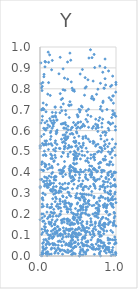
| Category | Series 0 |
|---|---|
| 0.025197886812686532 | 0.001 |
| 0.21413028773130482 | 0.596 |
| 0.48858155376974666 | 0.104 |
| 0.40430509097627965 | 0.222 |
| 0.04443078745256157 | 0.238 |
| 0.2402282362803827 | 0.051 |
| 0.5718057877575642 | 0.403 |
| 0.8271010419121944 | 0.734 |
| 0.4704751730745522 | 0.289 |
| 0.4556977791973077 | 0.439 |
| 0.2898596506972968 | 0.172 |
| 0.5551192829058258 | 0.482 |
| 0.45110149768724395 | 0.366 |
| 0.1990744925022092 | 0.713 |
| 0.691329299526118 | 0.12 |
| 0.06095792570090608 | 0.378 |
| 0.8773311487287229 | 0.209 |
| 0.006263118927576361 | 0.366 |
| 0.5590345230677798 | 0.165 |
| 0.7389482861343031 | 0.057 |
| 0.5720819566454467 | 0.247 |
| 0.8236305486623416 | 0.184 |
| 0.7119050161042874 | 0.285 |
| 0.07879720333586604 | 0.48 |
| 0.6499105780047775 | 0.413 |
| 0.07721514202325519 | 0.436 |
| 0.45784729605314545 | 0.414 |
| 0.02451577731107668 | 0.128 |
| 0.932908844918849 | 0.748 |
| 0.024970246443399624 | 0.234 |
| 0.4604541875513869 | 0.542 |
| 0.3451244808872541 | 0.253 |
| 0.9652149228587263 | 0.766 |
| 0.36962896928921374 | 0.016 |
| 0.16606018607317763 | 0.4 |
| 0.36483351287234056 | 0.178 |
| 0.7315489892914839 | 0.526 |
| 0.1860098832643824 | 0.059 |
| 0.17895400449943855 | 0.348 |
| 0.11813524467806491 | 0.163 |
| 0.7193814075641267 | 0.191 |
| 0.11759875074498838 | 0.085 |
| 0.9832061763752971 | 0.296 |
| 0.6063529815520603 | 0.051 |
| 0.0034663127849482445 | 0.528 |
| 0.12844158741016154 | 0.657 |
| 0.10420675366963283 | 0.628 |
| 0.727859347683194 | 0.155 |
| 0.6341998290440304 | 0.252 |
| 0.03020123077577519 | 0.248 |
| 0.15400965720167747 | 0.248 |
| 0.4671220865261183 | 0.416 |
| 0.5026561008548203 | 0.218 |
| 0.15286622200836197 | 0.891 |
| 0.4880335348712509 | 0.194 |
| 0.22558941656411857 | 0.174 |
| 0.4525285808456777 | 0.501 |
| 0.6771728218249609 | 0.754 |
| 0.9579707804010086 | 0.337 |
| 0.7197603956896848 | 0.901 |
| 0.1628848345181404 | 0.466 |
| 0.9646907159612438 | 0.233 |
| 0.020277503277967512 | 0.439 |
| 0.3299731509932555 | 0.265 |
| 0.5869344921777998 | 0.48 |
| 0.6563274902294516 | 0.389 |
| 0.9625176503764112 | 0.006 |
| 0.0900204820275502 | 0.072 |
| 0.5143163906701762 | 0.539 |
| 0.5907523411117203 | 0.333 |
| 0.6483754162402939 | 0.414 |
| 0.13159456360421262 | 0.347 |
| 0.6192005846492004 | 0.164 |
| 0.19874089762204883 | 0.105 |
| 0.47805872418403994 | 0.527 |
| 0.224144399712493 | 0.114 |
| 0.5606237482235635 | 0.206 |
| 0.03895434136517739 | 0.706 |
| 0.560359705210383 | 0.234 |
| 0.8636184292533413 | 0.818 |
| 0.9850959252697519 | 0.342 |
| 0.8465759924404586 | 0.461 |
| 0.9621171285710721 | 0.159 |
| 0.36093184160355885 | 0.563 |
| 0.5720134205714212 | 0.326 |
| 0.5455029559459526 | 0.205 |
| 0.5497223853607801 | 0.228 |
| 0.9687483142185594 | 0.158 |
| 0.9772666574351008 | 0.676 |
| 0.579280783987958 | 0.281 |
| 0.3032145212615386 | 0.284 |
| 0.8405511302019216 | 0.063 |
| 0.9252767246979215 | 0.163 |
| 0.6155288811631345 | 0.136 |
| 0.9733234656916732 | 0.15 |
| 0.03372061253257752 | 0.009 |
| 0.30392479443316134 | 0.579 |
| 0.4854990220822477 | 0.588 |
| 0.04748954717181819 | 0.409 |
| 0.3844109596772901 | 0.663 |
| 0.4324153831427141 | 0.113 |
| 0.24284131026815214 | 0.227 |
| 0.7341945231759877 | 0.126 |
| 0.17546131762466466 | 0.091 |
| 0.6069556300938677 | 0.37 |
| 0.8280435117954948 | 0.41 |
| 0.3440096239837005 | 0.06 |
| 0.7291566637212363 | 0.162 |
| 0.4047157809861346 | 0.937 |
| 0.7065359583478036 | 0.485 |
| 0.7001695145404064 | 0.415 |
| 0.4519627906702409 | 0.788 |
| 0.5216647634367185 | 0.389 |
| 0.3122712158800727 | 0.635 |
| 0.5638380115749367 | 0.36 |
| 0.9989264841207557 | 0.821 |
| 0.16300541404474966 | 0.308 |
| 0.8561175256296689 | 0.942 |
| 0.6394839722827644 | 0.616 |
| 0.5562589490872132 | 0.62 |
| 0.2927356546245098 | 0.324 |
| 0.8308332078736624 | 0.127 |
| 0.2214524880440789 | 0.591 |
| 0.002009016530433949 | 0.516 |
| 0.41071559563643967 | 0.061 |
| 0.4608585529967485 | 0.183 |
| 0.9269944205853824 | 0.018 |
| 0.37656805977944396 | 0.105 |
| 0.060794674670184956 | 0.532 |
| 0.6246542446006023 | 0.642 |
| 0.5515205720867589 | 0.502 |
| 0.11634807004211212 | 0.339 |
| 0.4697110657740725 | 0.198 |
| 0.5108246743888863 | 0.36 |
| 0.8786510272756582 | 0.119 |
| 0.5263109892197093 | 0.173 |
| 0.5504721788012336 | 0.285 |
| 0.2916340658201185 | 0.408 |
| 0.04049508910683952 | 0.201 |
| 0.8926720065154733 | 0.388 |
| 0.10773495395476929 | 0.975 |
| 0.4898359227873317 | 0.402 |
| 0.6254606844263559 | 0.235 |
| 0.07591637961338582 | 0.539 |
| 0.908100629852388 | 0.031 |
| 0.7134330689061162 | 0.373 |
| 0.6722248795017084 | 0.077 |
| 0.2123672538692093 | 0.379 |
| 0.7001525258719128 | 0.549 |
| 0.1783853008018329 | 0.649 |
| 0.4398765930227654 | 0.486 |
| 0.33990844237472817 | 0.677 |
| 0.11345560551095935 | 0.927 |
| 0.4723057709839633 | 0.545 |
| 0.705190465527857 | 0.752 |
| 0.8269691382516214 | 0.045 |
| 0.3925819573000705 | 0.054 |
| 0.9274287569215203 | 0.347 |
| 0.7442960541273467 | 0.774 |
| 0.11091688621002427 | 0.509 |
| 0.9620529973086206 | 0.146 |
| 0.8960482790314653 | 0.076 |
| 0.42528711193980473 | 0.13 |
| 0.16205937459268882 | 0.687 |
| 0.19906835078795504 | 0.542 |
| 0.4007988758825842 | 0.433 |
| 0.33677854988451317 | 0.39 |
| 0.8237855923326048 | 0.063 |
| 0.018691785293414642 | 0.701 |
| 0.26199672347784064 | 0.685 |
| 0.4721522799767147 | 0.11 |
| 0.12750994281392602 | 0.231 |
| 0.3948806305217383 | 0.022 |
| 0.38684035037920983 | 0.291 |
| 0.585699446806898 | 0.622 |
| 0.8045610104169469 | 0.497 |
| 0.4477837749919765 | 0.794 |
| 0.27500289237935216 | 0.068 |
| 0.4072392921025173 | 0.374 |
| 0.19011399654209382 | 0.037 |
| 0.46210866643680726 | 0.046 |
| 0.6039283758396782 | 0.251 |
| 0.5859902896639042 | 0.261 |
| 0.9575392210357279 | 0.437 |
| 0.15934730125391794 | 0.611 |
| 0.8533247778122379 | 0.157 |
| 0.09496689605058295 | 0.12 |
| 0.3733653996215305 | 0.05 |
| 0.7647526137512872 | 0.079 |
| 0.7914051635638613 | 0.449 |
| 0.5612930555437305 | 0.294 |
| 0.26742929918030245 | 0.198 |
| 0.49782769445678277 | 0.665 |
| 0.8138850335807942 | 0.617 |
| 0.30227731882785824 | 0.38 |
| 0.7697588845792649 | 0.217 |
| 0.533483441632903 | 0.239 |
| 0.22324586865950735 | 0.534 |
| 0.949139581280821 | 0.018 |
| 0.6607085980914413 | 0.333 |
| 0.1947012332926752 | 0.013 |
| 0.7985787309010601 | 0.575 |
| 0.6409905802365432 | 0.293 |
| 0.2773298578979633 | 0.214 |
| 0.8306411127015996 | 0.741 |
| 0.7038953628603181 | 0.375 |
| 0.40169764314069123 | 0.237 |
| 0.19084714774591505 | 0.366 |
| 0.3948477369461152 | 0.048 |
| 0.9478345317359333 | 0.241 |
| 0.22095314712342995 | 0.65 |
| 0.9955584897675781 | 0.065 |
| 0.08972932439687686 | 0.109 |
| 0.9580457837383053 | 0.285 |
| 0.9168131204737994 | 0.08 |
| 0.6781548436303226 | 0.054 |
| 0.5320187547295566 | 0.464 |
| 0.07722172022288609 | 0.013 |
| 0.09952379328775052 | 0.372 |
| 0.6907323391986143 | 0.053 |
| 0.06546834949911273 | 0.344 |
| 0.41030302669614693 | 0.044 |
| 0.44120235004911434 | 0.015 |
| 0.4177004337748922 | 0.522 |
| 0.8440230135647513 | 0.527 |
| 0.07774349367078082 | 0.602 |
| 0.7191535492045975 | 0.46 |
| 0.44390767256304997 | 0.548 |
| 0.7031456640398135 | 0.104 |
| 0.7413314652011742 | 0.193 |
| 0.19550013501050523 | 0.15 |
| 0.9221465949091429 | 0.079 |
| 0.6005881622952653 | 0.574 |
| 0.032324977127234034 | 0.539 |
| 0.7904018509659861 | 0.075 |
| 0.5589857761309275 | 0.295 |
| 0.8992256556505386 | 0.028 |
| 0.41007141490044796 | 0.159 |
| 0.6384191648891349 | 0.448 |
| 0.5309507124736739 | 0.02 |
| 0.1920913908414642 | 0.131 |
| 0.564624306797594 | 0.052 |
| 0.19621196957650766 | 0.482 |
| 0.5385009965150567 | 0.186 |
| 0.7887047409682093 | 0.157 |
| 0.3345130764218439 | 0.255 |
| 0.6307614424700095 | 0.843 |
| 0.9979676357946458 | 0.143 |
| 0.9581524225746767 | 0.248 |
| 0.956140144640581 | 0.861 |
| 0.28324023148681077 | 0.559 |
| 0.5363361855264522 | 0.005 |
| 0.9263922902481513 | 0.632 |
| 0.06902277982221361 | 0.155 |
| 0.7830242848627688 | 0.238 |
| 0.4398891300061797 | 0.093 |
| 0.7709979854277558 | 0.226 |
| 0.4801212756608354 | 0.28 |
| 0.47148464497950515 | 0.629 |
| 0.0609080031958279 | 0.191 |
| 0.15383076465899492 | 0.038 |
| 0.46350673560573785 | 0.067 |
| 0.8519001798606042 | 0.354 |
| 0.6111226021604117 | 0.694 |
| 0.2691427319630266 | 0.097 |
| 0.45827107349517104 | 0.044 |
| 0.5659597745994608 | 0.233 |
| 0.7587466678810794 | 0.626 |
| 0.5297909737599926 | 0.219 |
| 0.9009825701256149 | 0.498 |
| 0.7920743543193515 | 0.101 |
| 0.07185384768214675 | 0.138 |
| 0.603325422418182 | 0.019 |
| 0.3390733369968081 | 0.628 |
| 0.7712304483402567 | 0.106 |
| 0.5942333697378763 | 0.853 |
| 0.4495090726149603 | 0.109 |
| 0.7978491464313873 | 0.135 |
| 0.46501316111742474 | 0.124 |
| 0.4474738549652595 | 0.174 |
| 0.8416516000586042 | 0.804 |
| 0.754150032857336 | 0.621 |
| 0.9747012308747603 | 0.077 |
| 0.7090250317374539 | 0.106 |
| 0.7814782995078428 | 0.368 |
| 0.4777594377030744 | 0.091 |
| 0.8039837319778746 | 0.064 |
| 0.3037235592681554 | 0.896 |
| 0.24634716773017706 | 0.303 |
| 0.6173185867517751 | 0.049 |
| 0.02905400296289551 | 0.65 |
| 0.46434181517386075 | 0.626 |
| 0.7063738152059562 | 0.748 |
| 0.7950511141068445 | 0.826 |
| 0.18985875597604251 | 0.207 |
| 0.9987642036417084 | 0.831 |
| 0.6056513557919887 | 0.565 |
| 0.22006762770690702 | 0.12 |
| 0.11377161289866244 | 0.536 |
| 0.14254426674013632 | 0.312 |
| 0.3789466956351638 | 0.529 |
| 0.8024915338016808 | 0.56 |
| 0.4436654086973385 | 0.202 |
| 0.8929763839404897 | 0.04 |
| 0.32361347522001516 | 0.12 |
| 0.5679959793559715 | 0.123 |
| 0.5447556264900413 | 0.717 |
| 0.2242847394513191 | 0.652 |
| 0.5539732363056757 | 0.06 |
| 0.5344828855191042 | 0.341 |
| 0.7868973597773778 | 0.093 |
| 0.365322702147006 | 0.515 |
| 0.3625304517608171 | 0.21 |
| 0.3368842922956712 | 0.557 |
| 0.109242545879775 | 0.066 |
| 0.13980217346681978 | 0.317 |
| 0.3798862737535471 | 0.347 |
| 0.8943401027661623 | 0.086 |
| 0.42300453299720064 | 0.089 |
| 0.4418980410397355 | 0.639 |
| 0.6805002192378595 | 0.388 |
| 0.7618885101849137 | 0.798 |
| 0.0901728759682705 | 0.059 |
| 0.8561016237326388 | 0.307 |
| 0.5630754014052055 | 0.318 |
| 0.4798194514959362 | 0.49 |
| 0.09396702314795169 | 0.236 |
| 0.7734039897289361 | 0.146 |
| 0.39186401893902345 | 0.122 |
| 0.03593448506933694 | 0.113 |
| 0.874344498336461 | 0.236 |
| 0.38717506520077904 | 0.719 |
| 0.33676000165301123 | 0.695 |
| 0.3402873663949575 | 0.571 |
| 0.9066087811230189 | 0.041 |
| 0.9796217052784945 | 0.684 |
| 0.1267845846487663 | 0.962 |
| 0.3343927279772776 | 0.107 |
| 0.13182132641104571 | 0.341 |
| 0.7054442693675511 | 0.344 |
| 0.9804921510279025 | 0.057 |
| 0.8447930930610218 | 0.802 |
| 0.16408999021218484 | 0.06 |
| 0.8432070593426235 | 0.143 |
| 0.2655241107842574 | 0.951 |
| 0.9114323091118032 | 0.02 |
| 0.14802851539035788 | 0.009 |
| 0.5972631802874754 | 0.378 |
| 0.4020903179344374 | 0.245 |
| 0.9616632420855432 | 0.269 |
| 0.5405655801553322 | 0.156 |
| 0.17902962964832225 | 0.332 |
| 0.23035647603148768 | 0.248 |
| 0.7849736417659828 | 0.016 |
| 0.8013522572638774 | 0.072 |
| 0.8910612452694039 | 0.303 |
| 0.2837840114173902 | 0.393 |
| 0.6642114259134768 | 0.987 |
| 0.06900532290616723 | 0.293 |
| 0.1425757306645059 | 0.154 |
| 0.25237411626508244 | 0.312 |
| 0.8273745335925794 | 0.039 |
| 0.4005068298134261 | 0.15 |
| 0.0660209646970098 | 0.931 |
| 0.12842560673679115 | 0.342 |
| 0.6180225649797012 | 0.154 |
| 0.7801038222977863 | 0.035 |
| 0.3771680922040377 | 0.122 |
| 0.8087264641851538 | 0.41 |
| 0.6285683813453797 | 0.048 |
| 0.8374726857791308 | 0.234 |
| 0.09655688380406591 | 0.613 |
| 0.911122479115635 | 0.401 |
| 0.06475351923570172 | 0.609 |
| 0.18836173312103865 | 0.365 |
| 0.04159156931063723 | 0.732 |
| 0.6213430961428119 | 0.029 |
| 0.06555629846780175 | 0.905 |
| 0.04819458217653916 | 0.611 |
| 0.8717397820950386 | 0.015 |
| 0.3280843878281625 | 0.023 |
| 0.6854265176475329 | 0.764 |
| 0.955603323694563 | 0.113 |
| 0.20473497123445028 | 0.471 |
| 0.7824286014701479 | 0.01 |
| 0.043501074573775944 | 0.012 |
| 0.2741756379165735 | 0.33 |
| 0.6862199539612959 | 0.149 |
| 0.20530764217216413 | 0.282 |
| 0.10084867838045031 | 0.02 |
| 0.9577612307566913 | 0.636 |
| 0.9583216785881982 | 0.041 |
| 0.3505811357923594 | 0.28 |
| 0.9963015368545382 | 0.668 |
| 0.5897000538285105 | 0.089 |
| 0.8689766764764804 | 0.37 |
| 0.5233034107759669 | 0.689 |
| 0.5307124964081413 | 0.239 |
| 0.3514999601532548 | 0.056 |
| 0.9972431636012987 | 0.013 |
| 0.6683831231112578 | 0.178 |
| 0.06827036540755582 | 0.032 |
| 0.9311851737835538 | 0.405 |
| 0.9287364172254375 | 0.309 |
| 0.5400762027035731 | 0.333 |
| 0.7972730777159447 | 0.023 |
| 0.20582541574065227 | 0.021 |
| 0.7333016324426805 | 0.206 |
| 0.9892963768008527 | 0.482 |
| 0.7071663725097103 | 0.033 |
| 0.5952177472506838 | 0.206 |
| 0.15494662954196725 | 0.09 |
| 0.14060501553581395 | 0.487 |
| 0.584240968639001 | 0.296 |
| 0.02456371904780985 | 0.449 |
| 0.9953113803691618 | 0.536 |
| 0.5161148495228361 | 0.488 |
| 0.6296425540134282 | 0.365 |
| 0.418298774010357 | 0.614 |
| 0.25671178219258706 | 0.072 |
| 0.830897943676508 | 0.463 |
| 0.7585715228575746 | 0.067 |
| 0.051402543011725754 | 0.034 |
| 0.9281959228728854 | 0.811 |
| 0.7676664195996382 | 0.032 |
| 0.9226290684925353 | 0.488 |
| 0.312598411852811 | 0.612 |
| 0.29678375206375784 | 0.101 |
| 0.14683245325442296 | 0.032 |
| 0.5530640571064125 | 0.147 |
| 0.703536821029218 | 0.474 |
| 0.30691204129053407 | 0.728 |
| 0.565906182165732 | 0.57 |
| 0.9906668111566744 | 0.273 |
| 0.35659821072695297 | 0.229 |
| 0.9936353715936959 | 0.603 |
| 0.5466450541318641 | 0.619 |
| 0.41653239412111864 | 0.027 |
| 0.1997159060315793 | 0.131 |
| 0.05321037671463913 | 0.869 |
| 0.7776548030385441 | 0.422 |
| 0.8617400159088089 | 0.151 |
| 0.6083169495797259 | 0.81 |
| 0.8184272214999384 | 0.505 |
| 0.9195428792942364 | 0.199 |
| 0.36378232860726223 | 0.326 |
| 0.991878699202656 | 0.619 |
| 0.608768730796755 | 0.224 |
| 0.9446866975256019 | 0.663 |
| 0.7240141867323279 | 0.488 |
| 0.311948856951065 | 0.12 |
| 0.04449304517615216 | 0.356 |
| 0.7626813930786956 | 0.535 |
| 0.7067013137214129 | 0.419 |
| 0.09129774841451888 | 0.21 |
| 0.40824932267050973 | 0.521 |
| 0.04075679090351936 | 0.409 |
| 0.9017948677249393 | 0.264 |
| 0.8991388103806153 | 0.639 |
| 0.32816857832920254 | 0.521 |
| 0.3923249409852855 | 0.428 |
| 0.8683749630262318 | 0.376 |
| 0.7710112499006397 | 0.049 |
| 0.8884881725991269 | 0.354 |
| 0.09121330825763985 | 0.645 |
| 0.4966386775197532 | 0.254 |
| 0.16218776041944394 | 0.422 |
| 0.500190707641086 | 0.215 |
| 0.08820914998534501 | 0.336 |
| 0.21659341048255243 | 0.238 |
| 0.9255816631310064 | 0.297 |
| 0.6566712186370676 | 0.044 |
| 0.0332735009136601 | 0.279 |
| 0.8452537849310326 | 0.407 |
| 0.6195150062813478 | 0.456 |
| 0.4250156352318821 | 0.381 |
| 0.31996485833903143 | 0.512 |
| 0.19540169428684628 | 0.38 |
| 0.12254154330457911 | 0.055 |
| 0.12989238232046163 | 0.195 |
| 0.02745449906291475 | 0.275 |
| 0.5287159830795737 | 0.871 |
| 0.8820832382543359 | 0.555 |
| 0.8494270692677051 | 0.313 |
| 0.19964846248102697 | 0.671 |
| 0.037235395054718845 | 0.166 |
| 0.3411830118471907 | 0.237 |
| 0.7153454797790259 | 0.418 |
| 0.09756358928471676 | 0.121 |
| 0.314529658136104 | 0.32 |
| 0.32275917409917976 | 0.452 |
| 0.0688741857431302 | 0.428 |
| 0.6046699383076093 | 0.218 |
| 0.4402822018034379 | 0.443 |
| 0.996306204124361 | 0.784 |
| 0.7100596017940655 | 0.243 |
| 0.9504402230552976 | 0.078 |
| 0.20674249737522143 | 0.363 |
| 0.20445646676715956 | 0.165 |
| 0.35303897679245555 | 0.223 |
| 0.020991257393472962 | 0.104 |
| 0.25986869762227505 | 0.347 |
| 0.35416087217946757 | 0.125 |
| 0.5336332255170942 | 0.524 |
| 0.8697338250638036 | 0.042 |
| 0.4140555429475413 | 0.208 |
| 0.26648884530838735 | 0.777 |
| 0.856637751015408 | 0.902 |
| 0.5578722112487486 | 0.892 |
| 0.329246377771221 | 0.58 |
| 0.5096744190770951 | 0.137 |
| 0.9345192221607248 | 0.496 |
| 0.5774820963427973 | 0.055 |
| 0.9925700591350165 | 0.078 |
| 0.8810810710595229 | 0.701 |
| 0.956718124582553 | 0.766 |
| 0.7249271586273993 | 0.411 |
| 0.4391326144345672 | 0.203 |
| 0.5798870884685975 | 0.268 |
| 0.4426074136398357 | 0.114 |
| 0.82779421628915 | 0.281 |
| 0.44868200021481375 | 0.459 |
| 0.8131620068609434 | 0.401 |
| 0.637359095390284 | 0.702 |
| 0.8960285661212486 | 0.175 |
| 0.7978429306067848 | 0.069 |
| 0.7145517874532945 | 0.339 |
| 0.4561965525603071 | 0.482 |
| 0.6884866000229004 | 0.611 |
| 0.028965594277245432 | 0.183 |
| 0.1807525849416649 | 0.223 |
| 0.6397807507713877 | 0.322 |
| 0.5684732578866653 | 0.63 |
| 0.5931660643704855 | 0.803 |
| 0.261786166113126 | 0.272 |
| 0.8876200636945151 | 0.245 |
| 0.4487907933041667 | 0.063 |
| 0.3233993644040576 | 0.11 |
| 0.43415271576057834 | 0.376 |
| 0.7114686246968164 | 0.472 |
| 0.6711620660729468 | 0.166 |
| 0.6630019409705454 | 0.147 |
| 0.05269819204539017 | 0.702 |
| 0.7611512008091109 | 0.596 |
| 0.9775651135441973 | 0.402 |
| 0.24959292531541388 | 0.872 |
| 0.5000706729439848 | 0.077 |
| 0.7465936472323421 | 0.035 |
| 0.5049109423046944 | 0.276 |
| 0.23969644766741405 | 0.013 |
| 0.8347925246554861 | 0.342 |
| 0.0959882674558713 | 0.328 |
| 0.012521997520578698 | 0.637 |
| 0.43706325663492596 | 0.037 |
| 0.5006835675842818 | 0.156 |
| 0.26465227691043114 | 0.25 |
| 0.3552849140221833 | 0.176 |
| 0.8036551497422049 | 0.287 |
| 0.4181457259080281 | 0.129 |
| 0.43318215928368853 | 0.112 |
| 0.47112549704367834 | 0.095 |
| 0.4425214507931189 | 0.189 |
| 0.46685887895379174 | 0.227 |
| 0.04113128940026056 | 0.301 |
| 0.5321092516533982 | 0.413 |
| 0.1451893475730942 | 0.572 |
| 0.03692695876547547 | 0.83 |
| 0.09994069957507135 | 0.416 |
| 0.29790795290945526 | 0.633 |
| 0.4992754371769338 | 0.509 |
| 0.3278477220426669 | 0.793 |
| 0.6071406559684883 | 0.516 |
| 0.8486188149233981 | 0.548 |
| 0.44668215720087545 | 0.418 |
| 0.48926871052878385 | 0.676 |
| 0.41552059888665316 | 0.094 |
| 0.3733546468605832 | 0.094 |
| 0.08564745831047638 | 0.36 |
| 0.6713330673606118 | 0.162 |
| 0.3700607583408655 | 0.603 |
| 0.715462399212379 | 0.008 |
| 0.15973226703370302 | 0.173 |
| 0.31768042703101884 | 0.026 |
| 0.5676946750563634 | 0.221 |
| 0.1367985859098083 | 0.558 |
| 0.897304677487291 | 0.269 |
| 0.9943149742453228 | 0.004 |
| 0.865943769350482 | 0.213 |
| 0.453213562134713 | 0.467 |
| 0.46379438933582817 | 0.066 |
| 0.43359219264258675 | 0.181 |
| 0.826118948844565 | 0.879 |
| 0.3927865706566679 | 0.383 |
| 0.8191553173031388 | 0.694 |
| 0.2258253821626356 | 0.602 |
| 0.3675540282564943 | 0.476 |
| 0.6361758176832983 | 0.559 |
| 0.7145916190700001 | 0.471 |
| 0.13043991124868226 | 0.057 |
| 0.8540614756389469 | 0.514 |
| 0.25463349369912447 | 0.515 |
| 0.6266492248097513 | 0.066 |
| 0.04297015630084533 | 0.482 |
| 0.11975325623819955 | 0.439 |
| 0.3906669502186212 | 0.171 |
| 0.9320247772823954 | 0.122 |
| 0.927327456430381 | 0.294 |
| 0.9024232913244205 | 0.061 |
| 0.4700079600875713 | 0.525 |
| 0.5283023933769699 | 0.042 |
| 0.8621366309323681 | 0.46 |
| 0.8482752148918352 | 0.023 |
| 0.6291091611118533 | 0.028 |
| 0.42319676506410875 | 0.159 |
| 0.3696021960044138 | 0.488 |
| 0.9486165741138297 | 0.512 |
| 0.5034294549144543 | 0.639 |
| 0.39301933180583193 | 0.249 |
| 0.36999222800563725 | 0.345 |
| 0.34675650925685186 | 0.092 |
| 0.8694788376665119 | 0.18 |
| 0.002135535394686028 | 0.174 |
| 0.8606907883818727 | 0.578 |
| 0.20808425410671672 | 0.686 |
| 0.8705263382666175 | 0.59 |
| 0.46367729659705104 | 0.495 |
| 0.7928890904335166 | 0.333 |
| 0.2668117334581943 | 0.024 |
| 0.4142991678722696 | 0.024 |
| 0.7636263131023666 | 0.074 |
| 0.5356719211074693 | 0.642 |
| 0.8996771715972701 | 0.386 |
| 0.2571436078848526 | 0.129 |
| 0.19712438231640306 | 0.113 |
| 0.2957044007514875 | 0.754 |
| 0.7887449753168919 | 0.52 |
| 0.49895838852772434 | 0.617 |
| 0.13056355124175167 | 0.097 |
| 0.07663401290700322 | 0.012 |
| 0.3964676051094853 | 0.583 |
| 0.8414700895558236 | 0.12 |
| 0.9038063312198282 | 0.158 |
| 0.6116953818262969 | 0.294 |
| 0.6816556554250641 | 0.309 |
| 0.17024000472087863 | 0.19 |
| 0.31794390955913865 | 0.162 |
| 0.20677181577468862 | 0.516 |
| 0.017207358207501633 | 0.572 |
| 0.15100376709126784 | 0.348 |
| 0.2562237714535004 | 0.032 |
| 0.39917549047811796 | 0.498 |
| 0.6101533309590681 | 0.331 |
| 0.4316524083350014 | 0.152 |
| 0.16207209535150402 | 0.936 |
| 0.23924750196169475 | 0.07 |
| 0.28327490886773976 | 0.407 |
| 0.3109494038507382 | 0.407 |
| 0.4334987232681564 | 0.583 |
| 0.7296300120265629 | 0.031 |
| 0.40382036601408633 | 0.426 |
| 0.4113170369833563 | 0.833 |
| 0.5645410232622017 | 0.562 |
| 0.09952174545347736 | 0.179 |
| 0.6578515614373135 | 0.547 |
| 0.2963068495664287 | 0.544 |
| 0.3854432661749494 | 0.062 |
| 0.17490934638630373 | 0.666 |
| 0.4243384094008613 | 0.08 |
| 0.4531721256286798 | 0.567 |
| 0.7572384539135089 | 0.497 |
| 0.9516544905944467 | 0.237 |
| 0.9047004262909171 | 0.298 |
| 0.5523039742922413 | 0.344 |
| 0.9892581476754277 | 0.305 |
| 0.7055284517091311 | 0.131 |
| 0.947303056740587 | 0.47 |
| 0.43082127342884535 | 0.36 |
| 0.9435726281698226 | 0.275 |
| 0.4821481969399368 | 0.611 |
| 0.32708293237209773 | 0.522 |
| 0.438997128924731 | 0.039 |
| 0.14907199629237766 | 0.119 |
| 0.5726495242087402 | 0.091 |
| 0.6995193473052134 | 0.539 |
| 0.6807642477708543 | 0.037 |
| 0.9806386808373859 | 0.52 |
| 0.44860857136819376 | 0.406 |
| 0.30100048559795556 | 0.495 |
| 0.552779339875986 | 0.079 |
| 0.6011612399198254 | 0.455 |
| 0.8929560057279492 | 0.278 |
| 0.7119427821672024 | 0.964 |
| 0.6498872443995438 | 0.246 |
| 0.6993481510952632 | 0.837 |
| 0.41237214117486454 | 0.089 |
| 0.898341828473386 | 0.611 |
| 0.3078828794801194 | 0.42 |
| 0.7879954106553664 | 0.146 |
| 0.5347955031437455 | 0.196 |
| 0.5505995102322343 | 0.235 |
| 0.07594511908922508 | 0.079 |
| 0.49255506563574236 | 0.089 |
| 0.9513975669714851 | 0.028 |
| 0.8454390900917746 | 0.156 |
| 0.12705313720128963 | 0.359 |
| 0.1994466334295949 | 0.712 |
| 0.4006272501994338 | 0.129 |
| 0.5316331513615297 | 0.222 |
| 0.05170888541465668 | 0.167 |
| 0.1784505419714636 | 0.205 |
| 0.23482147787192187 | 0.141 |
| 0.33545539030950966 | 0.539 |
| 0.01848355052945294 | 0.805 |
| 0.9771109819262879 | 0.167 |
| 0.3995643982887863 | 0.403 |
| 0.7709739444759377 | 0.245 |
| 0.28230527381428994 | 0.476 |
| 0.5703272673952624 | 0.54 |
| 0.5231381221503353 | 0.184 |
| 0.18168273959778347 | 0.205 |
| 0.6009316103870666 | 0.389 |
| 0.2792958888144297 | 0.632 |
| 0.5796267519995801 | 0.017 |
| 0.9729524757506257 | 0.396 |
| 0.6820325867162755 | 0.398 |
| 0.7701953579519808 | 0.116 |
| 0.2641979824389735 | 0.201 |
| 0.037433796745249825 | 0.039 |
| 0.13662995321139626 | 0.189 |
| 0.459732464828673 | 0.105 |
| 0.6542372581072613 | 0.431 |
| 0.06924424513954586 | 0.485 |
| 0.32135436787911464 | 0.177 |
| 0.67016490664815 | 0.484 |
| 0.7038588750535144 | 0.043 |
| 0.4469226204530786 | 0.344 |
| 0.5024236248674727 | 0.334 |
| 0.8511992218197395 | 0.138 |
| 0.2638523526976394 | 0.514 |
| 0.3905876415778321 | 0.15 |
| 0.9029225712967447 | 0.64 |
| 0.36409032133369046 | 0.846 |
| 0.9180145529118203 | 0.268 |
| 0.8542188351959475 | 0.328 |
| 0.7402274377252541 | 0.252 |
| 0.7731565452685472 | 0.648 |
| 0.19238548379697407 | 0.154 |
| 0.8977902602101437 | 0.15 |
| 0.5436070391479503 | 0.122 |
| 0.8736863801846319 | 0.241 |
| 0.8754052008337211 | 0.033 |
| 0.8834490746070176 | 0.041 |
| 0.7510170546329527 | 0.204 |
| 0.5114818898536797 | 0.11 |
| 0.07537520074886206 | 0.435 |
| 0.14635102903862884 | 0.315 |
| 0.5017482989094929 | 0.159 |
| 0.01115717555812179 | 0.924 |
| 0.0230274095090518 | 0.367 |
| 0.9841689921190545 | 0.091 |
| 0.9955136661101407 | 0.4 |
| 0.9990948559853609 | 0.255 |
| 0.5660819030279758 | 0.142 |
| 0.15429599937731275 | 0.144 |
| 0.16370433754283553 | 0.084 |
| 0.5109875271504166 | 0.702 |
| 0.3411466910976517 | 0.556 |
| 0.2755337483739423 | 0.712 |
| 0.8563134320332484 | 0.029 |
| 0.4215907499071567 | 0.104 |
| 0.3840771075363726 | 0.418 |
| 0.9360780250163486 | 0.002 |
| 0.8534701899665688 | 0.25 |
| 0.5690545277828457 | 0.05 |
| 0.8558586335595909 | 0.848 |
| 0.8055168551648905 | 0.515 |
| 0.26978110929230636 | 0.411 |
| 0.9299949770234338 | 0.249 |
| 0.5045000141121163 | 0.06 |
| 0.1741851032858832 | 0.621 |
| 0.1019189066503825 | 0.774 |
| 0.3367815652677528 | 0.053 |
| 0.47138721267749895 | 0.128 |
| 0.9797981915314325 | 0.365 |
| 0.5860189921232447 | 0.769 |
| 0.733641936979812 | 0.655 |
| 0.7864557159639436 | 0.32 |
| 0.3787789390292229 | 0.224 |
| 0.14372692993199743 | 0.597 |
| 0.6012310766030567 | 0.009 |
| 0.2442525466598059 | 0.19 |
| 0.41026606807193655 | 0.723 |
| 0.2889274194635325 | 0.05 |
| 0.03451105428971413 | 0.06 |
| 0.8483017658782519 | 0.051 |
| 0.7736349073087526 | 0.212 |
| 0.07960915599110496 | 0.69 |
| 0.5195634703688098 | 0.131 |
| 0.7197456959985266 | 0.333 |
| 0.022372802766073563 | 0.201 |
| 0.9317770202459312 | 0.252 |
| 0.6719354418387771 | 0.378 |
| 0.23415847819821112 | 0.096 |
| 0.2048125601802594 | 0.053 |
| 0.5653826760193208 | 0.005 |
| 0.46997888855126135 | 0.279 |
| 0.313224377309398 | 0.068 |
| 0.269777750816957 | 0.23 |
| 0.34496907972772195 | 0.131 |
| 0.14791753143519182 | 0.378 |
| 0.18034867027871004 | 0.094 |
| 0.27830029639618004 | 0.308 |
| 0.22877169890746585 | 0.141 |
| 0.882586806738063 | 0.438 |
| 0.9082712090523637 | 0.435 |
| 0.2905996863015252 | 0.029 |
| 0.48187432419642795 | 0.464 |
| 0.4232419309122383 | 0.803 |
| 0.9172375671979138 | 0.062 |
| 0.41498434514999705 | 0.007 |
| 0.15507254557191708 | 0.43 |
| 0.6220173298480844 | 0.118 |
| 0.7372737277536231 | 0.61 |
| 0.48909252102756373 | 0.249 |
| 0.09551588127029853 | 0.246 |
| 0.97554653127885 | 0.182 |
| 0.029640173795827396 | 0.812 |
| 0.7710897261219094 | 0.442 |
| 0.5961535946738666 | 0.12 |
| 0.1371367360690161 | 0.59 |
| 0.7100040128536869 | 0.278 |
| 0.8182123004869631 | 0.331 |
| 0.20771094461357298 | 0.665 |
| 0.26293241028526504 | 0.028 |
| 0.8231822906429069 | 0.334 |
| 0.13449676412326939 | 0.768 |
| 0.415640285318011 | 0.248 |
| 0.9503157078060628 | 0.269 |
| 0.31541548602189007 | 0.547 |
| 0.48608750786809996 | 0.299 |
| 0.08395401237105071 | 0.375 |
| 0.842232267487165 | 0.154 |
| 0.1445027637734786 | 0.21 |
| 0.6852258016515806 | 0.241 |
| 0.38236714731501364 | 0.303 |
| 0.35977163018877323 | 0.156 |
| 0.9322685426169833 | 0.45 |
| 0.8555493103593771 | 0.325 |
| 0.47136379172216725 | 0.55 |
| 0.17806565250641704 | 0.509 |
| 0.030380168777695782 | 0.45 |
| 0.7887188805648995 | 0.166 |
| 0.43846601770099003 | 0.365 |
| 0.5220282320170946 | 0.001 |
| 0.9520964546288299 | 0.558 |
| 0.1991818116761952 | 0.26 |
| 0.03984765368614862 | 0.267 |
| 0.29860840481799666 | 0.288 |
| 0.9068672693684409 | 0.366 |
| 0.6475272420141452 | 0.195 |
| 0.4858772154573857 | 0.167 |
| 0.7849308791685251 | 0.264 |
| 0.13699280687166127 | 0.1 |
| 0.009936611541759732 | 0.004 |
| 0.7667794411082884 | 0.614 |
| 0.8317629236686674 | 0.357 |
| 0.5120439126874056 | 0.4 |
| 0.7373650308244155 | 0.228 |
| 0.32341047880380935 | 0.248 |
| 0.6968367571907245 | 0.201 |
| 0.6877761688724424 | 0.089 |
| 0.11204434919472572 | 0.186 |
| 0.9310063503734815 | 0.332 |
| 0.502420103862276 | 0.055 |
| 0.729061231568875 | 0.412 |
| 0.34402311052503154 | 0.61 |
| 0.49527239833451975 | 0.202 |
| 0.9932185372244052 | 0.332 |
| 0.039555769278952546 | 0.026 |
| 0.11999197860434496 | 0.382 |
| 0.1809872132472311 | 0.296 |
| 0.12432789464895921 | 0.008 |
| 0.5854947072609119 | 0.124 |
| 0.2809407217858725 | 0.171 |
| 0.6240739288135397 | 0.498 |
| 0.7736565867547894 | 0.501 |
| 0.011877741625850202 | 0.824 |
| 0.3037251819597637 | 0.795 |
| 0.26652567068878674 | 0.324 |
| 0.7545040931976436 | 0.366 |
| 0.3069961517828129 | 0.176 |
| 0.11042271663298331 | 0.101 |
| 0.1211412453048627 | 0.083 |
| 0.30754423103640727 | 0.493 |
| 0.48571335718209996 | 0.171 |
| 0.047404853252224655 | 0.531 |
| 0.36884035690402617 | 0.621 |
| 0.7079553753544717 | 0.366 |
| 0.6951704516393417 | 0.033 |
| 0.05677723036191651 | 0.141 |
| 0.9842931983815348 | 0.19 |
| 0.9197443069341781 | 0.163 |
| 0.12867656807016703 | 0.152 |
| 0.9139896407658743 | 0.439 |
| 0.06062665685939461 | 0.442 |
| 0.9119714619476192 | 0.538 |
| 0.37708994634349446 | 0.722 |
| 0.15384456846684202 | 0.394 |
| 0.9745204326405101 | 0.209 |
| 0.6746116837942199 | 0.391 |
| 0.6086116578488048 | 0.112 |
| 0.26349051461379847 | 0.263 |
| 0.6423587290394076 | 0.133 |
| 0.9569046094991184 | 0.385 |
| 0.4185401577639979 | 0.056 |
| 0.2025335039908962 | 0.381 |
| 0.28721029575460055 | 0.157 |
| 0.14134554175859915 | 0.647 |
| 0.9071041082535418 | 0.601 |
| 0.8513279743865035 | 0.594 |
| 0.5467386493081299 | 0.064 |
| 0.050953293891049745 | 0.582 |
| 0.31900258289830674 | 0.612 |
| 0.643766707226888 | 0.947 |
| 0.5272286230670726 | 0.268 |
| 0.4151447533742274 | 0.358 |
| 0.3964325266902651 | 0.048 |
| 0.039921624998043304 | 0.045 |
| 0.6141913041644043 | 0.067 |
| 0.9939705888445365 | 0.017 |
| 0.28006622891820787 | 0.748 |
| 0.8429240322462447 | 0.239 |
| 0.7372721113021665 | 0.532 |
| 0.9418660584746259 | 0.378 |
| 0.68117835358283 | 0.429 |
| 0.3251785726607812 | 0.428 |
| 0.06861075854004561 | 0.605 |
| 0.4207400292877017 | 0.587 |
| 0.5310843567949817 | 0.699 |
| 0.8594735309140377 | 0.477 |
| 0.599643188865783 | 0.099 |
| 0.29778301195510604 | 0.343 |
| 0.47126774704133834 | 0.405 |
| 0.017552761818742435 | 0.699 |
| 0.0653254764991581 | 0.551 |
| 0.28698446774490505 | 0.695 |
| 0.3672601153591243 | 0.305 |
| 0.5167276061467094 | 0.001 |
| 0.6320960994820588 | 0.196 |
| 0.9656875804588383 | 0.731 |
| 0.7150226140534106 | 0.098 |
| 0.30542182618482394 | 0.09 |
| 0.1597829522267703 | 0.206 |
| 0.2998628286358159 | 0.26 |
| 0.8071273010913321 | 0.38 |
| 0.6844271141645247 | 0.949 |
| 0.7864857203272778 | 0.662 |
| 0.07241038569579406 | 0.928 |
| 0.40654004335076166 | 0.072 |
| 0.3939553506235638 | 0.738 |
| 0.9378438388753721 | 0.746 |
| 0.5283113784568586 | 0.612 |
| 0.5021312822521821 | 0.516 |
| 0.8317051796029975 | 0.243 |
| 0.7871086482914851 | 0.909 |
| 0.14684080286316237 | 0.161 |
| 0.7605420585462506 | 0.219 |
| 0.501218020093788 | 0.669 |
| 0.9046273835191431 | 0.196 |
| 0.7750122164257612 | 0.277 |
| 0.05936241184735325 | 0.335 |
| 0.06061186707395794 | 0.127 |
| 0.7902780061158889 | 0.114 |
| 0.46547078556368915 | 0.403 |
| 0.4316650774163896 | 0.01 |
| 0.5615519793433864 | 0.135 |
| 0.14125011774737317 | 0.232 |
| 0.3938087382614477 | 0.971 |
| 0.7247412491185091 | 0.206 |
| 0.7126083655241843 | 0.545 |
| 0.6049009568969977 | 0.234 |
| 0.4022070574759289 | 0.15 |
| 0.7251766411844311 | 0.141 |
| 0.0853900419152539 | 0.723 |
| 0.21516064870758211 | 0.192 |
| 0.49301338417153406 | 0.163 |
| 0.21385683127623134 | 0.332 |
| 0.025206297366978103 | 0.016 |
| 0.8476464489297326 | 0.051 |
| 0.6389763422795338 | 0.409 |
| 0.032003917333024545 | 0.668 |
| 0.9574229614260857 | 0.677 |
| 0.4041228925596748 | 0.604 |
| 0.06930935240909752 | 0.427 |
| 0.4320038033158504 | 0.075 |
| 0.28811720373672856 | 0.162 |
| 0.9788573805999771 | 0.337 |
| 0.3906136563256386 | 0.409 |
| 0.33127895677675123 | 0.638 |
| 0.838301468138187 | 0.107 |
| 0.6344754859895182 | 0.196 |
| 0.12794238705723793 | 0.422 |
| 0.4823273117281738 | 0.443 |
| 0.5983209172598011 | 0.411 |
| 0.09445740335207176 | 0.003 |
| 0.9093716659901775 | 0.757 |
| 0.368128599817899 | 0.571 |
| 0.9022619820647503 | 0.885 |
| 0.6414893330254104 | 0.265 |
| 0.29742745089889466 | 0.399 |
| 0.6422916801234304 | 0.264 |
| 0.40591197480374264 | 0.286 |
| 0.7271999155913563 | 0.324 |
| 0.9837088897979822 | 0.364 |
| 0.5109598956052377 | 0.1 |
| 0.6301091177588848 | 0.072 |
| 0.9814041979149483 | 0.205 |
| 0.5323248259226915 | 0.298 |
| 0.9886205666938422 | 0.338 |
| 0.07775001755767996 | 0.053 |
| 0.6726428537288273 | 0.404 |
| 0.004069089923075975 | 0.524 |
| 0.7571596509715849 | 0.23 |
| 0.4793615464682267 | 0.594 |
| 0.03914080091965899 | 0.7 |
| 0.1815961614663436 | 0.452 |
| 0.36597236238310105 | 0.029 |
| 0.5486008526580857 | 0.236 |
| 0.6696165731070395 | 0.668 |
| 0.25228279045828006 | 0.41 |
| 0.5115554509248922 | 0.573 |
| 0.550363130844809 | 0.519 |
| 0.6049882456269021 | 0.068 |
| 0.21877476440085886 | 0.305 |
| 0.4266220684651112 | 0.615 |
| 0.0034885718773365326 | 0.327 |
| 0.32250263092923814 | 0.851 |
| 0.2032846778312124 | 0.551 |
| 0.09973340822468502 | 0.013 |
| 0.6518314380288074 | 0.113 |
| 0.879295833219894 | 0.213 |
| 0.7998668265483005 | 0.715 |
| 0.6343709821394602 | 0.26 |
| 0.3211627219521974 | 0.236 |
| 0.8200569624076036 | 0.148 |
| 0.026820022737782945 | 0.792 |
| 0.7650425875175348 | 0.183 |
| 0.29301154789220685 | 0.409 |
| 0.22411856489295268 | 0.108 |
| 0.055082706506818235 | 0.357 |
| 0.29122361598942115 | 0.081 |
| 0.664641297792019 | 0.103 |
| 0.9225368000269084 | 0.312 |
| 0.7409654530541742 | 0.188 |
| 0.7308739378056103 | 0.361 |
| 0.3209592247128277 | 0.564 |
| 0.32923914775029295 | 0.348 |
| 0.8070265874289162 | 0.517 |
| 0.1882013285226447 | 0.151 |
| 0.16004391452248 | 0.667 |
| 0.5616354256958181 | 0.088 |
| 0.058183254205435686 | 0.502 |
| 0.14536024371572942 | 0.537 |
| 0.32163432922447577 | 0.524 |
| 0.4509458199125115 | 0.469 |
| 0.050772826772251145 | 0.078 |
| 0.41104257844599523 | 0.244 |
| 0.5988123787304118 | 0.113 |
| 0.3809757764785613 | 0.165 |
| 0.4563068217534083 | 0.154 |
| 0.08281853061094202 | 0.532 |
| 0.18640588948807213 | 0.376 |
| 0.003810882340101518 | 0.333 |
| 0.497779952527562 | 0.637 |
| 0.1863523370262904 | 0.455 |
| 0.5213952224227841 | 0.012 |
| 0.2571035976082281 | 0.102 |
| 0.9277658762886917 | 0.63 |
| 0.04651939731842225 | 0.065 |
| 0.3573556515460924 | 0.169 |
| 0.8738120645558053 | 0.23 |
| 0.5692742651081372 | 0.315 |
| 0.2152974409671441 | 0.274 |
| 0.6987421494061491 | 0.116 |
| 0.16790041158324953 | 0.274 |
| 0.17398926372583023 | 0.124 |
| 0.9193124264133546 | 0.45 |
| 0.4294797585453962 | 0.793 |
| 0.15940111484356623 | 0.529 |
| 0.2566899877848624 | 0.311 |
| 0.5681684612921722 | 0.53 |
| 0.7733856111422933 | 0.219 |
| 0.42281667290714364 | 0.006 |
| 0.7986182263061408 | 0.28 |
| 0.4419595648324419 | 0.152 |
| 0.4306578230742305 | 0.424 |
| 0.7299834587675121 | 0.358 |
| 0.7314273510065799 | 0.631 |
| 0.5764543868453811 | 0.048 |
| 0.824744150135717 | 0.654 |
| 0.9542243607896651 | 0.505 |
| 0.5592789101078138 | 0.033 |
| 0.7939279918754866 | 0.703 |
| 0.7511197939225546 | 0.257 |
| 0.2361675794202348 | 0.038 |
| 0.15905879998602768 | 0.086 |
| 0.2637848136390416 | 0.395 |
| 0.5559269735138681 | 0.712 |
| 0.8913086539531564 | 0.523 |
| 0.4787202370132938 | 0.467 |
| 0.11997137104084976 | 0.157 |
| 0.8400310762155355 | 0.458 |
| 0.7573701830064133 | 0.406 |
| 0.6677130792841939 | 0.467 |
| 0.6760417468585621 | 0.291 |
| 0.9784127991123411 | 0.368 |
| 0.39580333100378773 | 0.407 |
| 0.09517221753556349 | 0.346 |
| 0.17399398346805806 | 0.053 |
| 0.2964685292626611 | 0.009 |
| 0.4641942927757372 | 0.01 |
| 0.8145675673958304 | 0.635 |
| 0.1747585102529411 | 0.631 |
| 0.9457266818671303 | 0.391 |
| 0.8594893686307958 | 0.274 |
| 0.4731283828388476 | 0.045 |
| 0.9404888912224283 | 0.275 |
| 0.799380916712122 | 0.447 |
| 0.8918025212647607 | 0.397 |
| 0.11295170220480488 | 0.83 |
| 0.8603419848666879 | 0.534 |
| 0.3764214369570287 | 0.254 |
| 0.7966835760106449 | 0.001 |
| 0.542943226088782 | 0.403 |
| 0.21656921575159827 | 0.028 |
| 0.33466817701664664 | 0.32 |
| 0.40609810301957183 | 0.096 |
| 0.7732985521650947 | 0.047 |
| 0.9994950013246023 | 0.061 |
| 0.4693575352344067 | 0.477 |
| 0.10974392241945607 | 0.329 |
| 0.5665219224399641 | 0.026 |
| 0.8277895143886271 | 0.185 |
| 0.825437806331927 | 0.591 |
| 0.08489281912452085 | 0.039 |
| 0.3628450026994523 | 0.928 |
| 0.2012133013885674 | 0.3 |
| 0.12761176841172084 | 0.62 |
| 0.562036508423587 | 0.279 |
| 0.5045583774765013 | 0.184 |
| 0.9574372945724117 | 0.695 |
| 0.8079338090674428 | 0.096 |
| 0.1896641167562324 | 0.639 |
| 0.7806026028150488 | 0.157 |
| 0.8896573961637133 | 0.333 |
| 0.06916810880926949 | 0.119 |
| 0.03812256526143698 | 0.3 |
| 0.5969508444892694 | 0.271 |
| 0.46436261898517817 | 0.387 |
| 0.4944585132781808 | 0.478 |
| 0.4887415631880059 | 0.324 |
| 0.4136161804035323 | 0.409 |
| 0.7043757146819608 | 0.62 |
| 0.5236488865093849 | 0.275 |
| 0.21341551993750585 | 0.585 |
| 0.2717874850118278 | 0.107 |
| 0.1567954738439723 | 0.48 |
| 0.34904114092701977 | 0.591 |
| 0.050953108384849344 | 0.858 |
| 0.6044822206553037 | 0.2 |
| 0.5348644360077117 | 0.104 |
| 0.6048836654730891 | 0.654 |
| 0.08543138785958315 | 0.551 |
| 0.345552995106835 | 0.019 |
| 0.26279080470842586 | 0.127 |
| 0.16873819456910155 | 0.106 |
| 0.2048157615609716 | 0.313 |
| 0.2366193191650936 | 0.438 |
| 0.7475924301030786 | 0.402 |
| 0.8121382873633659 | 0.13 |
| 0.3860927360898958 | 0.521 |
| 0.5188413045760847 | 0.374 |
| 0.427361239774258 | 0.322 |
| 0.24354108328246704 | 0.235 |
| 0.2488734980133751 | 0.123 |
| 0.1809665234161274 | 0.056 |
| 0.38197186028902474 | 0.128 |
| 0.8078555637896258 | 0.176 |
| 0.6262825511605818 | 0.468 |
| 0.3902796291381455 | 0.393 |
| 0.5377470932000743 | 0.234 |
| 0.7819279580327289 | 0.425 |
| 0.5888382961922032 | 0.085 |
| 0.32784242290798593 | 0.524 |
| 0.14485013536824265 | 0.467 |
| 0.5363299187120147 | 0.029 |
| 0.767477103391968 | 0.201 |
| 0.3637005494212643 | 0.211 |
| 0.9439575325322385 | 0.817 |
| 0.0858325425783697 | 0.018 |
| 0.012377436309491174 | 0.413 |
| 0.18679541691652957 | 0.315 |
| 0.5861092956474793 | 0.133 |
| 0.7952999789373439 | 0.047 |
| 0.15351600822192735 | 0.234 |
| 0.3064376086685512 | 0.135 |
| 0.6287792671696935 | 0.674 |
| 0.06522703688739762 | 0.637 |
| 0.20240958107124007 | 0.502 |
| 0.15879907237050195 | 0.637 |
| 0.1678515387069901 | 0.322 |
| 0.8663714902093146 | 0.033 |
| 0.4946935479236806 | 0.127 |